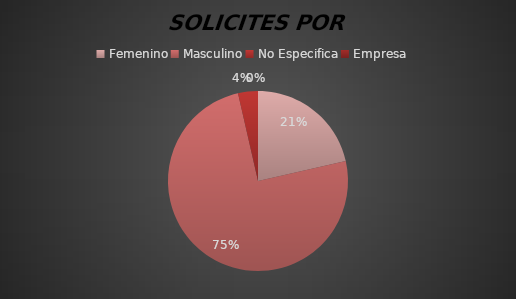
| Category | TOTAL |
|---|---|
| Femenino | 6 |
| Masculino | 21 |
| No Especifica | 1 |
| Empresa | 0 |